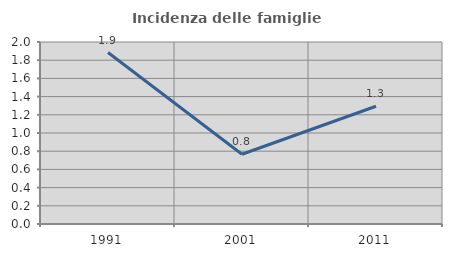
| Category | Incidenza delle famiglie numerose |
|---|---|
| 1991.0 | 1.884 |
| 2001.0 | 0.767 |
| 2011.0 | 1.294 |